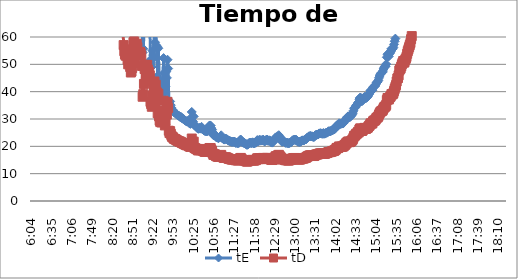
| Category | tE | tD |
|---|---|---|
| 0.25277777777777777 | 17882.69 | 12549.256 |
| 0.2534722222222222 | 17882.69 | 12549.256 |
| 0.25416666666666665 | 17882.69 | 12549.256 |
| 0.2548611111111111 | 17882.69 | 12549.256 |
| 0.2555555555555556 | 17882.69 | 12549.256 |
| 0.25625000000000003 | 17882.69 | 12549.256 |
| 0.2569444444444445 | 17882.69 | 12549.256 |
| 0.2576388888888889 | 17882.69 | 12549.256 |
| 0.25833333333333336 | 17882.69 | 12549.256 |
| 0.2590277777777778 | 17882.69 | 12549.256 |
| 0.25972222222222224 | 17882.69 | 12549.256 |
| 0.2604166666666667 | 17882.69 | 12549.256 |
| 0.2611111111111111 | 8941.345 | 6274.628 |
| 0.26180555555555557 | 8941.345 | 6274.628 |
| 0.2625 | 8941.345 | 6274.628 |
| 0.26319444444444445 | 8941.345 | 6274.628 |
| 0.2638888888888889 | 8941.345 | 6274.628 |
| 0.26458333333333334 | 8941.345 | 6274.628 |
| 0.2652777777777778 | 8941.345 | 6274.628 |
| 0.2659722222222222 | 8941.345 | 6274.628 |
| 0.26666666666666666 | 5960.897 | 4183.085 |
| 0.2673611111111111 | 5960.897 | 4183.085 |
| 0.26805555555555555 | 5960.897 | 4183.085 |
| 0.26875 | 5960.897 | 4183.085 |
| 0.26944444444444443 | 5960.897 | 4183.085 |
| 0.2701388888888889 | 4470.672 | 3137.314 |
| 0.2708333333333333 | 4470.672 | 3137.314 |
| 0.27152777777777776 | 4470.672 | 3137.314 |
| 0.2722222222222222 | 4470.672 | 3137.314 |
| 0.27291666666666664 | 3576.538 | 2509.851 |
| 0.2736111111111111 | 3576.538 | 2509.851 |
| 0.2743055555555555 | 3576.538 | 2509.851 |
| 0.27499999999999997 | 2980.448 | 2091.543 |
| 0.27569444444444446 | 2980.448 | 2091.543 |
| 0.27638888888888885 | 2980.448 | 2091.543 |
| 0.27708333333333335 | 2980.448 | 2091.543 |
| 0.2777777777777778 | 2554.67 | 1792.751 |
| 0.27847222222222223 | 2554.67 | 1792.751 |
| 0.2791666666666667 | 2235.336 | 1568.657 |
| 0.2798611111111111 | 2235.336 | 1568.657 |
| 0.28055555555555556 | 2235.336 | 1568.657 |
| 0.28125 | 1986.966 | 1394.362 |
| 0.28194444444444444 | 1986.966 | 1394.362 |
| 0.2826388888888889 | 1788.269 | 1254.926 |
| 0.2833333333333333 | 1788.269 | 1254.926 |
| 0.28402777777777777 | 1625.699 | 1140.841 |
| 0.2847222222222222 | 1625.699 | 1140.841 |
| 0.28541666666666665 | 1490.224 | 1045.771 |
| 0.28611111111111115 | 1490.224 | 1045.771 |
| 0.28680555555555554 | 1375.592 | 965.327 |
| 0.28750000000000003 | 1375.592 | 965.327 |
| 0.2881944444444445 | 1277.335 | 896.375 |
| 0.2888888888888889 | 1192.179 | 836.617 |
| 0.28958333333333336 | 1117.668 | 784.328 |
| 0.2902777777777778 | 1117.668 | 784.328 |
| 0.29097222222222224 | 1051.923 | 738.192 |
| 0.2916666666666667 | 993.483 | 697.181 |
| 0.2923611111111111 | 941.194 | 660.487 |
| 0.29305555555555557 | 941.194 | 660.487 |
| 0.29375 | 894.134 | 627.463 |
| 0.29444444444444445 | 851.557 | 597.584 |
| 0.2951388888888889 | 812.85 | 570.421 |
| 0.29583333333333334 | 777.508 | 545.62 |
| 0.2965277777777778 | 745.112 | 522.886 |
| 0.2972222222222222 | 715.308 | 501.97 |
| 0.29791666666666666 | 687.796 | 482.664 |
| 0.2986111111111111 | 662.322 | 464.787 |
| 0.29930555555555555 | 638.667 | 448.188 |
| 0.3 | 616.644 | 432.733 |
| 0.30277777777777776 | 541.9 | 380.28 |
| 0.3055555555555555 | 458.531 | 321.776 |
| 0.30833333333333335 | 397.393 | 278.872 |
| 0.30972222222222223 | 372.556 | 261.443 |
| 0.3111111111111111 | 343.898 | 241.332 |
| 0.3125 | 319.334 | 224.094 |
| 0.31319444444444444 | 308.322 | 216.366 |
| 0.3138888888888889 | 298.045 | 209.154 |
| 0.3145833333333333 | 293.159 | 205.726 |
| 0.31527777777777777 | 283.852 | 199.195 |
| 0.3159722222222222 | 275.118 | 193.065 |
| 0.31666666666666665 | 266.906 | 187.302 |
| 0.31736111111111115 | 262.981 | 184.548 |
| 0.31805555555555554 | 255.467 | 179.275 |
| 0.31875000000000003 | 244.968 | 171.908 |
| 0.3194444444444445 | 241.658 | 169.585 |
| 0.3201388888888889 | 238.436 | 167.323 |
| 0.32083333333333336 | 235.299 | 165.122 |
| 0.3215277777777778 | 229.265 | 160.888 |
| 0.32222222222222224 | 223.534 | 156.866 |
| 0.3229166666666667 | 215.454 | 151.196 |
| 0.3236111111111111 | 207.938 | 145.922 |
| 0.32430555555555557 | 198.697 | 139.436 |
| 0.325 | 192.287 | 134.938 |
| 0.32569444444444445 | 184.358 | 129.374 |
| 0.3263888888888889 | 178.827 | 125.493 |
| 0.32708333333333334 | 173.618 | 121.837 |
| 0.3277777777777778 | 170.311 | 119.517 |
| 0.3284722222222222 | 167.128 | 117.283 |
| 0.32916666666666666 | 164.061 | 115.131 |
| 0.3298611111111111 | 159.667 | 112.047 |
| 0.33055555555555555 | 158.254 | 111.055 |
| 0.33125 | 155.502 | 109.124 |
| 0.33194444444444443 | 150.275 | 105.456 |
| 0.3326388888888889 | 144.215 | 101.204 |
| 0.3333333333333333 | 138.626 | 97.281 |
| 0.3340277777777778 | 134.456 | 94.355 |
| 0.3347222222222222 | 131.49 | 92.274 |
| 0.3354166666666667 | 127.733 | 89.638 |
| 0.3361111111111111 | 124.185 | 87.148 |
| 0.3368055555555556 | 120.829 | 84.792 |
| 0.33749999999999997 | 118.428 | 83.108 |
| 0.33819444444444446 | 116.121 | 81.489 |
| 0.33888888888888885 | 113.182 | 79.426 |
| 0.33958333333333335 | 110.387 | 77.465 |
| 0.34027777777777773 | 107.727 | 75.598 |
| 0.34097222222222223 | 105.192 | 73.819 |
| 0.3416666666666666 | 102.187 | 71.71 |
| 0.3423611111111111 | 101.606 | 71.303 |
| 0.3430555555555555 | 100.465 | 70.501 |
| 0.34375 | 98.799 | 69.333 |
| 0.3444444444444445 | 100.465 | 70.501 |
| 0.3451388888888889 | 99.348 | 69.718 |
| 0.3458333333333334 | 97.72 | 68.575 |
| 0.34652777777777777 | 97.189 | 68.202 |
| 0.34722222222222227 | 97.189 | 68.202 |
| 0.34791666666666665 | 96.663 | 67.834 |
| 0.34861111111111115 | 97.72 | 68.575 |
| 0.34930555555555554 | 98.799 | 69.333 |
| 0.35000000000000003 | 99.903 | 70.108 |
| 0.3506944444444444 | 100.465 | 70.501 |
| 0.3513888888888889 | 100.465 | 70.501 |
| 0.3520833333333333 | 99.903 | 70.108 |
| 0.3527777777777778 | 98.799 | 69.333 |
| 0.3534722222222222 | 98.257 | 68.952 |
| 0.3541666666666667 | 96.143 | 67.469 |
| 0.3548611111111111 | 95.629 | 67.108 |
| 0.35555555555555557 | 95.121 | 66.751 |
| 0.35625 | 93.627 | 65.703 |
| 0.35694444444444445 | 94.617 | 66.398 |
| 0.3576388888888889 | 93.139 | 65.361 |
| 0.35833333333333334 | 89.413 | 62.746 |
| 0.3590277777777778 | 81.285 | 57.042 |
| 0.3597222222222222 | 78.09 | 54.8 |
| 0.36041666666666666 | 76.422 | 53.629 |
| 0.3611111111111111 | 75.774 | 53.175 |
| 0.36180555555555555 | 78.778 | 55.283 |
| 0.3625 | 75.774 | 53.175 |
| 0.36319444444444443 | 73.591 | 51.643 |
| 0.3638888888888889 | 71.246 | 49.997 |
| 0.3645833333333333 | 72.991 | 51.221 |
| 0.3652777777777778 | 75.454 | 52.95 |
| 0.3659722222222222 | 69.854 | 49.021 |
| 0.3666666666666667 | 66.976 | 47.001 |
| 0.3673611111111111 | 67.482 | 47.356 |
| 0.3680555555555556 | 69.313 | 48.641 |
| 0.36874999999999997 | 79.127 | 55.528 |
| 0.36944444444444446 | 82.79 | 58.098 |
| 0.37013888888888885 | 83.175 | 58.369 |
| 0.37083333333333335 | 71.818 | 50.399 |
| 0.37152777777777773 | 76.097 | 53.401 |
| 0.37222222222222223 | 80.917 | 56.784 |
| 0.3729166666666666 | 82.031 | 57.565 |
| 0.3736111111111111 | 80.191 | 56.275 |
| 0.3743055555555555 | 75.774 | 53.175 |
| 0.375 | 76.75 | 53.859 |
| 0.3756944444444445 | 77.414 | 54.326 |
| 0.3763888888888889 | 77.751 | 54.562 |
| 0.3770833333333334 | 77.081 | 54.092 |
| 0.37777777777777777 | 75.774 | 53.175 |
| 0.37847222222222227 | 70.404 | 49.407 |
| 0.37916666666666665 | 54.355 | 38.144 |
| 0.37986111111111115 | 55.709 | 39.094 |
| 0.38055555555555554 | 61.033 | 42.83 |
| 0.38125000000000003 | 68.78 | 48.266 |
| 0.3819444444444444 | 70.963 | 49.799 |
| 0.3826388888888889 | 62.527 | 43.879 |
| 0.3833333333333333 | 64.096 | 44.979 |
| 0.3840277777777778 | 70.963 | 49.799 |
| 0.3847222222222222 | 68.516 | 48.081 |
| 0.3854166666666667 | 64.326 | 45.141 |
| 0.3861111111111111 | 67.228 | 47.178 |
| 0.38680555555555557 | 65.504 | 45.968 |
| 0.3875 | 51.684 | 36.27 |
| 0.38819444444444445 | 50.516 | 35.45 |
| 0.3888888888888889 | 49.128 | 34.476 |
| 0.38958333333333334 | 55.024 | 38.613 |
| 0.3902777777777778 | 53.381 | 37.46 |
| 0.3909722222222222 | 52.289 | 36.694 |
| 0.39166666666666666 | 62.309 | 43.726 |
| 0.3923611111111111 | 58.061 | 40.744 |
| 0.39305555555555555 | 60.619 | 42.54 |
| 0.39375 | 56.951 | 39.966 |
| 0.39444444444444443 | 56.412 | 39.588 |
| 0.3951388888888889 | 45.736 | 32.095 |
| 0.3958333333333333 | 55.883 | 39.216 |
| 0.3965277777777778 | 44.155 | 30.986 |
| 0.3972222222222222 | 41.88 | 29.389 |
| 0.3979166666666667 | 41.11 | 28.849 |
| 0.3986111111111111 | 42.679 | 29.95 |
| 0.3993055555555556 | 40.921 | 28.717 |
| 0.39999999999999997 | 43.938 | 30.834 |
| 0.40069444444444446 | 42.477 | 29.808 |
| 0.40138888888888885 | 52.289 | 36.694 |
| 0.40208333333333335 | 46.936 | 32.938 |
| 0.40277777777777773 | 39.389 | 27.642 |
| 0.40347222222222223 | 41.782 | 29.321 |
| 0.4041666666666666 | 47.309 | 33.199 |
| 0.4048611111111111 | 45.045 | 31.61 |
| 0.4055555555555555 | 51.684 | 36.27 |
| 0.40625 | 48.463 | 34.009 |
| 0.4069444444444445 | 36.645 | 25.716 |
| 0.4076388888888889 | 35.411 | 24.85 |
| 0.4083333333333334 | 36.421 | 25.559 |
| 0.40902777777777777 | 35.064 | 24.606 |
| 0.40972222222222227 | 34.062 | 23.903 |
| 0.41041666666666665 | 33.426 | 23.457 |
| 0.41111111111111115 | 33.301 | 23.369 |
| 0.41180555555555554 | 32.752 | 22.984 |
| 0.41250000000000003 | 32.455 | 22.775 |
| 0.4131944444444444 | 32.279 | 22.652 |
| 0.4138888888888889 | 32.221 | 22.611 |
| 0.4145833333333333 | 31.933 | 22.409 |
| 0.4152777777777778 | 31.651 | 22.211 |
| 0.4159722222222222 | 31.539 | 22.133 |
| 0.4173611111111111 | 31.318 | 21.978 |
| 0.41805555555555557 | 31.209 | 21.901 |
| 0.41875 | 31.046 | 21.787 |
| 0.41944444444444445 | 30.779 | 21.599 |
| 0.4201388888888889 | 30.885 | 21.674 |
| 0.42083333333333334 | 30.569 | 21.452 |
| 0.4215277777777778 | 30.31 | 21.27 |
| 0.4222222222222222 | 30.207 | 21.198 |
| 0.42291666666666666 | 30.005 | 21.056 |
| 0.4236111111111111 | 29.854 | 20.95 |
| 0.42430555555555555 | 29.656 | 20.811 |
| 0.425 | 29.461 | 20.674 |
| 0.42569444444444443 | 29.316 | 20.573 |
| 0.4263888888888889 | 29.125 | 20.439 |
| 0.4270833333333333 | 29.03 | 20.372 |
| 0.4277777777777778 | 29.316 | 20.573 |
| 0.4284722222222222 | 28.89 | 20.273 |
| 0.4291666666666667 | 28.521 | 20.015 |
| 0.4298611111111111 | 28.43 | 19.951 |
| 0.4305555555555556 | 28.206 | 19.794 |
| 0.43124999999999997 | 28.983 | 20.339 |
| 0.43194444444444446 | 32.573 | 22.858 |
| 0.43263888888888885 | 30.939 | 21.712 |
| 0.43333333333333335 | 29.078 | 20.405 |
| 0.43402777777777773 | 30.939 | 21.712 |
| 0.43472222222222223 | 27.725 | 19.456 |
| 0.4354166666666666 | 27.554 | 19.336 |
| 0.4361111111111111 | 27.344 | 19.188 |
| 0.4368055555555555 | 27.177 | 19.072 |
| 0.4375 | 27.136 | 19.043 |
| 0.4381944444444445 | 26.532 | 18.619 |
| 0.4388888888888889 | 26.415 | 18.537 |
| 0.4395833333333334 | 26.493 | 18.591 |
| 0.44027777777777777 | 26.811 | 18.814 |
| 0.44097222222222227 | 26.493 | 18.591 |
| 0.44166666666666665 | 26.493 | 18.591 |
| 0.44236111111111115 | 27.136 | 19.043 |
| 0.44305555555555554 | 26.337 | 18.482 |
| 0.44375000000000003 | 26.376 | 18.509 |
| 0.4444444444444444 | 25.992 | 18.24 |
| 0.4451388888888889 | 25.805 | 18.109 |
| 0.4458333333333333 | 25.62 | 17.979 |
| 0.4465277777777778 | 25.62 | 17.979 |
| 0.4472222222222222 | 25.547 | 17.928 |
| 0.4479166666666667 | 25.547 | 17.928 |
| 0.4486111111111111 | 25.547 | 17.928 |
| 0.44930555555555557 | 26.183 | 18.374 |
| 0.45 | 26.972 | 18.928 |
| 0.45069444444444445 | 27.597 | 19.366 |
| 0.4513888888888889 | 27.639 | 19.396 |
| 0.45208333333333334 | 27.554 | 19.336 |
| 0.4527777777777778 | 26.651 | 18.702 |
| 0.4534722222222222 | 26.068 | 18.293 |
| 0.45416666666666666 | 24.872 | 17.454 |
| 0.4548611111111111 | 24.101 | 16.913 |
| 0.45555555555555555 | 24.068 | 16.89 |
| 0.45625 | 24.363 | 17.097 |
| 0.45694444444444443 | 24.133 | 16.936 |
| 0.4576388888888889 | 23.437 | 16.447 |
| 0.4583333333333333 | 23.315 | 16.361 |
| 0.4590277777777778 | 23.254 | 16.319 |
| 0.4597222222222222 | 23.074 | 16.193 |
| 0.4604166666666667 | 23.015 | 16.151 |
| 0.4611111111111111 | 23.194 | 16.277 |
| 0.4618055555555556 | 23.407 | 16.426 |
| 0.46249999999999997 | 23.686 | 16.622 |
| 0.46319444444444446 | 24.036 | 16.867 |
| 0.46388888888888885 | 23.194 | 16.277 |
| 0.46458333333333335 | 22.897 | 16.068 |
| 0.46527777777777773 | 22.868 | 16.048 |
| 0.46597222222222223 | 22.494 | 15.785 |
| 0.4666666666666666 | 22.466 | 15.765 |
| 0.4673611111111111 | 22.752 | 15.966 |
| 0.4680555555555555 | 22.752 | 15.966 |
| 0.46875 | 22.665 | 15.905 |
| 0.4694444444444445 | 22.551 | 15.825 |
| 0.4701388888888889 | 22.325 | 15.667 |
| 0.4708333333333334 | 22.132 | 15.531 |
| 0.47152777777777777 | 21.996 | 15.436 |
| 0.47222222222222227 | 21.942 | 15.398 |
| 0.47291666666666665 | 21.861 | 15.341 |
| 0.47361111111111115 | 21.702 | 15.23 |
| 0.47430555555555554 | 21.65 | 15.193 |
| 0.47500000000000003 | 21.65 | 15.193 |
| 0.4756944444444444 | 21.65 | 15.193 |
| 0.4763888888888889 | 21.676 | 15.211 |
| 0.4770833333333333 | 21.755 | 15.267 |
| 0.4777777777777778 | 21.571 | 15.138 |
| 0.4784722222222222 | 21.264 | 14.922 |
| 0.4791666666666667 | 21.34 | 14.975 |
| 0.4798611111111111 | 21.264 | 14.922 |
| 0.48055555555555557 | 21.213 | 14.886 |
| 0.48125 | 21.188 | 14.869 |
| 0.48194444444444445 | 21.264 | 14.922 |
| 0.4826388888888889 | 21.729 | 15.248 |
| 0.48333333333333334 | 22.381 | 15.706 |
| 0.4840277777777778 | 22.466 | 15.765 |
| 0.4847222222222222 | 21.861 | 15.341 |
| 0.48541666666666666 | 21.519 | 15.101 |
| 0.4861111111111111 | 21.519 | 15.101 |
| 0.48680555555555555 | 21.264 | 14.922 |
| 0.4875 | 21.365 | 14.993 |
| 0.48819444444444443 | 21.063 | 14.781 |
| 0.4888888888888889 | 21.038 | 14.764 |
| 0.4895833333333333 | 20.746 | 14.558 |
| 0.4902777777777778 | 20.578 | 14.441 |
| 0.4909722222222222 | 20.578 | 14.441 |
| 0.4916666666666667 | 20.722 | 14.541 |
| 0.4923611111111111 | 21.014 | 14.746 |
| 0.4930555555555556 | 21.34 | 14.975 |
| 0.49374999999999997 | 21.314 | 14.957 |
| 0.49444444444444446 | 21.289 | 14.94 |
| 0.49513888888888885 | 21.188 | 14.869 |
| 0.49583333333333335 | 21.238 | 14.904 |
| 0.49652777777777773 | 21.468 | 15.065 |
| 0.49722222222222223 | 21.163 | 14.851 |
| 0.4979166666666666 | 21.063 | 14.781 |
| 0.4986111111111111 | 21.188 | 14.869 |
| 0.4993055555555555 | 21.314 | 14.957 |
| 0.5 | 21.34 | 14.975 |
| 0.5006944444444444 | 21.755 | 15.267 |
| 0.5013888888888889 | 22.27 | 15.628 |
| 0.5020833333333333 | 22.187 | 15.57 |
| 0.5027777777777778 | 21.835 | 15.323 |
| 0.5034722222222222 | 22.27 | 15.628 |
| 0.5041666666666667 | 22.381 | 15.706 |
| 0.5048611111111111 | 22.077 | 15.493 |
| 0.5055555555555555 | 22.242 | 15.609 |
| 0.50625 | 22.132 | 15.531 |
| 0.5069444444444444 | 22.215 | 15.589 |
| 0.5076388888888889 | 22.466 | 15.765 |
| 0.5083333333333333 | 22.215 | 15.589 |
| 0.5090277777777777 | 21.808 | 15.304 |
| 0.5097222222222222 | 21.888 | 15.36 |
| 0.5104166666666666 | 22.242 | 15.609 |
| 0.5111111111111112 | 22.215 | 15.589 |
| 0.5118055555555555 | 22.494 | 15.785 |
| 0.5125000000000001 | 22.077 | 15.493 |
| 0.5131944444444444 | 22.023 | 15.455 |
| 0.513888888888889 | 22.215 | 15.589 |
| 0.5145833333333333 | 22.159 | 15.551 |
| 0.5152777777777778 | 21.996 | 15.436 |
| 0.5159722222222222 | 21.545 | 15.12 |
| 0.5166666666666667 | 21.442 | 15.047 |
| 0.517361111111111 | 21.365 | 14.993 |
| 0.5180555555555556 | 21.519 | 15.101 |
| 0.5187499999999999 | 21.915 | 15.379 |
| 0.5194444444444445 | 22.27 | 15.628 |
| 0.5201388888888888 | 22.608 | 15.865 |
| 0.5208333333333334 | 23.285 | 16.34 |
| 0.5215277777777778 | 23.224 | 16.298 |
| 0.5222222222222223 | 23.254 | 16.319 |
| 0.5229166666666667 | 23.686 | 16.622 |
| 0.5236111111111111 | 23.686 | 16.622 |
| 0.5243055555555556 | 24.068 | 16.89 |
| 0.525 | 23.623 | 16.578 |
| 0.5256944444444445 | 23.104 | 16.214 |
| 0.5263888888888889 | 22.723 | 15.946 |
| 0.5270833333333333 | 22.132 | 15.531 |
| 0.5277777777777778 | 21.624 | 15.174 |
| 0.5284722222222222 | 21.755 | 15.267 |
| 0.5291666666666667 | 22.023 | 15.455 |
| 0.5298611111111111 | 21.915 | 15.379 |
| 0.5305555555555556 | 21.494 | 15.083 |
| 0.53125 | 21.314 | 14.957 |
| 0.5319444444444444 | 21.264 | 14.922 |
| 0.5326388888888889 | 21.365 | 14.993 |
| 0.5333333333333333 | 21.213 | 14.886 |
| 0.5340277777777778 | 21.238 | 14.904 |
| 0.5347222222222222 | 21.088 | 14.799 |
| 0.5354166666666667 | 21.213 | 14.886 |
| 0.5361111111111111 | 21.365 | 14.993 |
| 0.5368055555555555 | 21.365 | 14.993 |
| 0.5375 | 21.597 | 15.156 |
| 0.5381944444444444 | 21.729 | 15.248 |
| 0.5388888888888889 | 22.187 | 15.57 |
| 0.5395833333333333 | 22.298 | 15.647 |
| 0.5402777777777777 | 22.353 | 15.687 |
| 0.5409722222222222 | 22.409 | 15.726 |
| 0.5416666666666666 | 22.438 | 15.746 |
| 0.5423611111111112 | 22.27 | 15.628 |
| 0.5430555555555555 | 22.325 | 15.667 |
| 0.5437500000000001 | 22.023 | 15.455 |
| 0.5444444444444444 | 21.729 | 15.248 |
| 0.545138888888889 | 21.702 | 15.23 |
| 0.5458333333333333 | 21.624 | 15.174 |
| 0.5465277777777778 | 21.65 | 15.193 |
| 0.5472222222222222 | 21.676 | 15.211 |
| 0.5479166666666667 | 21.861 | 15.341 |
| 0.548611111111111 | 22.105 | 15.512 |
| 0.5493055555555556 | 22.187 | 15.57 |
| 0.5499999999999999 | 22.132 | 15.531 |
| 0.5506944444444445 | 22.159 | 15.551 |
| 0.5513888888888888 | 22.298 | 15.647 |
| 0.5520833333333334 | 22.494 | 15.785 |
| 0.5527777777777778 | 22.551 | 15.825 |
| 0.5534722222222223 | 22.636 | 15.885 |
| 0.5541666666666667 | 23.074 | 16.193 |
| 0.5548611111111111 | 23.254 | 16.319 |
| 0.5555555555555556 | 23.376 | 16.404 |
| 0.55625 | 23.654 | 16.6 |
| 0.5569444444444445 | 23.654 | 16.6 |
| 0.5576388888888889 | 23.812 | 16.71 |
| 0.5583333333333333 | 23.654 | 16.6 |
| 0.5590277777777778 | 23.654 | 16.6 |
| 0.5597222222222222 | 23.654 | 16.6 |
| 0.5604166666666667 | 23.499 | 16.49 |
| 0.5611111111111111 | 23.437 | 16.447 |
| 0.5618055555555556 | 23.468 | 16.469 |
| 0.5625 | 23.749 | 16.666 |
| 0.5631944444444444 | 24.068 | 16.89 |
| 0.5638888888888889 | 24.231 | 17.004 |
| 0.5645833333333333 | 24.231 | 17.004 |
| 0.5652777777777778 | 24.33 | 17.074 |
| 0.5659722222222222 | 24.363 | 17.097 |
| 0.5666666666666667 | 24.564 | 17.238 |
| 0.5673611111111111 | 24.734 | 17.357 |
| 0.5680555555555555 | 24.734 | 17.357 |
| 0.56875 | 24.803 | 17.405 |
| 0.5694444444444444 | 24.7 | 17.333 |
| 0.5701388888888889 | 24.598 | 17.262 |
| 0.5708333333333333 | 24.632 | 17.285 |
| 0.5715277777777777 | 24.872 | 17.454 |
| 0.5722222222222222 | 24.598 | 17.262 |
| 0.5729166666666666 | 24.734 | 17.357 |
| 0.5736111111111112 | 24.666 | 17.309 |
| 0.5743055555555555 | 24.941 | 17.502 |
| 0.5750000000000001 | 25.046 | 17.576 |
| 0.5756944444444444 | 25.011 | 17.551 |
| 0.576388888888889 | 25.294 | 17.75 |
| 0.5770833333333333 | 25.51 | 17.902 |
| 0.5777777777777778 | 25.51 | 17.902 |
| 0.5784722222222222 | 25.474 | 17.876 |
| 0.5791666666666667 | 25.547 | 17.928 |
| 0.579861111111111 | 25.694 | 18.031 |
| 0.5805555555555556 | 25.842 | 18.135 |
| 0.5812499999999999 | 25.955 | 18.214 |
| 0.5819444444444445 | 26.03 | 18.267 |
| 0.5826388888888888 | 26.259 | 18.428 |
| 0.5833333333333334 | 26.221 | 18.401 |
| 0.5840277777777778 | 26.651 | 18.702 |
| 0.5847222222222223 | 26.811 | 18.814 |
| 0.5854166666666667 | 27.512 | 19.307 |
| 0.5861111111111111 | 27.725 | 19.456 |
| 0.5868055555555556 | 27.554 | 19.336 |
| 0.5875 | 27.725 | 19.456 |
| 0.5881944444444445 | 28.43 | 19.951 |
| 0.5888888888888889 | 28.206 | 19.794 |
| 0.5895833333333333 | 28.206 | 19.794 |
| 0.5902777777777778 | 28.251 | 19.825 |
| 0.5909722222222222 | 28.34 | 19.888 |
| 0.5916666666666667 | 28.34 | 19.888 |
| 0.5923611111111111 | 28.43 | 19.951 |
| 0.5930555555555556 | 28.567 | 20.047 |
| 0.59375 | 29.03 | 20.372 |
| 0.5944444444444444 | 29.268 | 20.539 |
| 0.5951388888888889 | 29.607 | 20.777 |
| 0.5958333333333333 | 30.156 | 21.162 |
| 0.5965277777777778 | 30.413 | 21.342 |
| 0.5972222222222222 | 30.832 | 21.637 |
| 0.5979166666666667 | 30.993 | 21.749 |
| 0.5986111111111111 | 30.939 | 21.712 |
| 0.5993055555555555 | 30.674 | 21.525 |
| 0.6 | 30.779 | 21.599 |
| 0.6006944444444444 | 31.1 | 21.825 |
| 0.6013888888888889 | 31.263 | 21.939 |
| 0.6020833333333333 | 31.707 | 22.25 |
| 0.6027777777777777 | 32.163 | 22.571 |
| 0.6034722222222222 | 32.994 | 23.154 |
| 0.6041666666666666 | 33.933 | 23.813 |
| 0.6048611111111112 | 34.062 | 23.903 |
| 0.6055555555555555 | 34.324 | 24.087 |
| 0.6062500000000001 | 34.995 | 24.558 |
| 0.6069444444444444 | 35.064 | 24.606 |
| 0.607638888888889 | 35.411 | 24.85 |
| 0.6083333333333333 | 36.054 | 25.301 |
| 0.6090277777777778 | 35.765 | 25.099 |
| 0.6097222222222222 | 37.256 | 26.144 |
| 0.6104166666666667 | 37.807 | 26.531 |
| 0.611111111111111 | 37.807 | 26.531 |
| 0.6118055555555556 | 37.333 | 26.199 |
| 0.6124999999999999 | 36.495 | 25.611 |
| 0.6131944444444445 | 36.796 | 25.822 |
| 0.6138888888888888 | 37.333 | 26.199 |
| 0.6145833333333334 | 37.727 | 26.475 |
| 0.6152777777777778 | 38.129 | 26.757 |
| 0.6159722222222223 | 37.807 | 26.531 |
| 0.6166666666666667 | 37.569 | 26.364 |
| 0.6173611111111111 | 37.887 | 26.587 |
| 0.6180555555555556 | 38.048 | 26.701 |
| 0.61875 | 38.293 | 26.872 |
| 0.6194444444444445 | 38.875 | 27.281 |
| 0.6201388888888889 | 39.131 | 27.46 |
| 0.6208333333333333 | 39.651 | 27.825 |
| 0.6215277777777778 | 40.459 | 28.392 |
| 0.6222222222222222 | 40.367 | 28.328 |
| 0.6229166666666667 | 40.367 | 28.328 |
| 0.6236111111111111 | 40.55 | 28.456 |
| 0.6243055555555556 | 41.491 | 29.117 |
| 0.625 | 41.88 | 29.389 |
| 0.6256944444444444 | 41.88 | 29.389 |
| 0.6263888888888889 | 42.077 | 29.528 |
| 0.6270833333333333 | 42.578 | 29.879 |
| 0.6277777777777778 | 43.195 | 30.312 |
| 0.6284722222222222 | 43.51 | 30.533 |
| 0.6291666666666667 | 43.616 | 30.608 |
| 0.6298611111111111 | 44.155 | 30.986 |
| 0.6305555555555555 | 45.045 | 31.61 |
| 0.63125 | 45.736 | 32.095 |
| 0.6319444444444444 | 46.328 | 32.511 |
| 0.6326388888888889 | 46.691 | 32.766 |
| 0.6333333333333333 | 46.936 | 32.938 |
| 0.6340277777777777 | 47.06 | 33.024 |
| 0.6347222222222222 | 47.56 | 33.376 |
| 0.6354166666666666 | 48.332 | 33.917 |
| 0.6361111111111112 | 48.86 | 34.288 |
| 0.6368055555555555 | 49.264 | 34.571 |
| 0.6375000000000001 | 49.264 | 34.571 |
| 0.6381944444444444 | 50.092 | 35.152 |
| 0.638888888888889 | 52.596 | 36.91 |
| 0.6395833333333333 | 53.702 | 37.685 |
| 0.6402777777777778 | 53.381 | 37.46 |
| 0.6409722222222222 | 52.907 | 37.128 |
| 0.6416666666666667 | 53.864 | 37.799 |
| 0.642361111111111 | 54.19 | 38.028 |
| 0.6430555555555556 | 54.687 | 38.377 |
| 0.6437499999999999 | 55.709 | 39.094 |
| 0.6444444444444445 | 55.536 | 38.973 |
| 0.6451388888888888 | 55.709 | 39.094 |
| 0.6458333333333334 | 56.235 | 39.463 |
| 0.6465277777777778 | 57.316 | 40.222 |
| 0.6472222222222223 | 58.44 | 41.011 |
| 0.6479166666666667 | 59.411 | 41.692 |
| 0.6486111111111111 | 60.414 | 42.396 |
| 0.6493055555555556 | 62.309 | 43.726 |
| 0.65 | 63.867 | 44.819 |
| 0.6506944444444445 | 64.096 | 44.979 |
| 0.6513888888888889 | 65.504 | 45.968 |
| 0.6520833333333333 | 67.995 | 47.716 |
| 0.6527777777777778 | 68.78 | 48.266 |
| 0.6534722222222222 | 69.045 | 48.453 |
| 0.6541666666666667 | 70.128 | 49.213 |
| 0.6548611111111111 | 71.246 | 49.997 |
| 0.6555555555555556 | 72.108 | 50.602 |
| 0.65625 | 72.991 | 51.221 |
| 0.6569444444444444 | 72.108 | 50.602 |
| 0.6576388888888889 | 72.4 | 50.807 |
| 0.6583333333333333 | 73.591 | 51.643 |
| 0.6590277777777778 | 74.202 | 52.072 |
| 0.6597222222222222 | 75.137 | 52.728 |
| 0.6604166666666667 | 76.75 | 53.859 |
| 0.6611111111111111 | 78.09 | 54.8 |
| 0.6618055555555555 | 79.127 | 55.528 |
| 0.6625 | 80.191 | 56.275 |
| 0.6631944444444444 | 81.285 | 57.042 |
| 0.6638888888888889 | 82.409 | 57.831 |
| 0.6645833333333333 | 84.352 | 59.195 |
| 0.6652777777777777 | 85.974 | 60.333 |
| 0.6659722222222222 | 87.233 | 61.216 |
| 0.6666666666666666 | 88.092 | 61.819 |
| 0.6673611111111111 | 89.863 | 63.062 |
| 0.6680555555555556 | 92.656 | 65.022 |
| 0.6687500000000001 | 95.121 | 66.751 |
| 0.6694444444444444 | 96.663 | 67.834 |
| 0.6701388888888888 | 98.257 | 68.952 |
| 0.6708333333333334 | 99.903 | 70.108 |
| 0.6715277777777778 | 102.774 | 72.122 |
| 0.6722222222222222 | 103.969 | 72.961 |
| 0.6729166666666666 | 106.445 | 74.698 |
| 0.6736111111111112 | 109.71 | 76.989 |
| 0.6743055555555556 | 112.47 | 78.926 |
| 0.6749999999999999 | 115.372 | 80.963 |
| 0.6756944444444444 | 118.428 | 83.108 |
| 0.6763888888888889 | 123.329 | 86.547 |
| 0.6770833333333334 | 127.733 | 89.638 |
| 0.6777777777777777 | 129.585 | 90.937 |
| 0.6784722222222223 | 132.464 | 92.957 |
| 0.6791666666666667 | 134.456 | 94.355 |
| 0.6798611111111111 | 138.626 | 97.281 |
| 0.6805555555555555 | 141.926 | 99.597 |
| 0.68125 | 145.388 | 102.026 |
| 0.6819444444444445 | 151.548 | 106.35 |
| 0.6826388888888889 | 154.161 | 108.183 |
| 0.6833333333333332 | 155.502 | 109.124 |
| 0.6840277777777778 | 158.254 | 111.055 |
| 0.6847222222222222 | 162.57 | 114.084 |
| 0.6854166666666667 | 168.705 | 118.389 |
| 0.686111111111111 | 171.949 | 120.666 |
| 0.6868055555555556 | 175.32 | 123.032 |
| 0.6875 | 178.827 | 125.493 |
| 0.6881944444444444 | 182.476 | 128.054 |
| 0.688888888888889 | 188.239 | 132.097 |
| 0.6895833333333333 | 192.287 | 134.938 |
| 0.6902777777777778 | 196.513 | 137.904 |
| 0.6909722222222222 | 200.929 | 141.003 |
| 0.6916666666666668 | 205.548 | 144.244 |
| 0.6923611111111111 | 210.385 | 147.638 |
| 0.6930555555555555 | 215.454 | 151.196 |
| 0.69375 | 220.774 | 154.929 |
| 0.6944444444444445 | 226.363 | 158.851 |
| 0.6951388888888889 | 232.243 | 162.977 |
| 0.6958333333333333 | 238.436 | 167.323 |
| 0.6965277777777777 | 244.968 | 171.908 |
| 0.6972222222222223 | 248.371 | 174.295 |
| 0.6979166666666666 | 255.467 | 179.275 |
| 0.6986111111111111 | 262.981 | 184.548 |
| 0.6993055555555556 | 266.906 | 187.302 |
| 0.7000000000000001 | 270.95 | 190.14 |
| 0.7006944444444444 | 279.417 | 196.082 |
| 0.7013888888888888 | 283.852 | 199.195 |
| 0.7020833333333334 | 288.43 | 202.407 |
| 0.7027777777777778 | 293.159 | 205.726 |
| 0.7034722222222222 | 303.096 | 212.699 |
| 0.7041666666666666 | 308.322 | 216.366 |
| 0.7048611111111112 | 313.731 | 220.162 |
| 0.7055555555555556 | 325.14 | 228.168 |
| 0.7062499999999999 | 331.161 | 232.394 |
| 0.7069444444444444 | 337.409 | 236.778 |
| 0.7076388888888889 | 350.641 | 246.064 |
| 0.7083333333333334 | 357.654 | 250.985 |
| 0.7090277777777777 | 364.953 | 256.107 |
| 0.7097222222222223 | 380.483 | 267.005 |
| 0.7104166666666667 | 388.754 | 272.81 |
| 0.7111111111111111 | 397.393 | 278.872 |
| 0.7118055555555555 | 406.425 | 285.21 |
| 0.7125 | 415.877 | 291.843 |
| 0.7131944444444445 | 425.778 | 298.792 |
| 0.7138888888888889 | 436.163 | 306.079 |
| 0.7145833333333332 | 447.067 | 313.731 |
| 0.7152777777777778 | 470.597 | 330.244 |
| 0.7159722222222222 | 483.316 | 339.169 |
| 0.7166666666666667 | 496.741 | 348.59 |
| 0.717361111111111 | 510.934 | 358.55 |
| 0.7180555555555556 | 525.961 | 369.096 |
| 0.71875 | 541.9 | 380.28 |
| 0.7194444444444444 | 558.834 | 392.164 |
| 0.720138888888889 | 596.09 | 418.309 |
| 0.7208333333333333 | 616.644 | 432.733 |
| 0.7215277777777778 | 638.667 | 448.188 |
| 0.7222222222222222 | 662.322 | 464.787 |
| 0.7229166666666668 | 687.796 | 482.664 |
| 0.7236111111111111 | 715.308 | 501.97 |
| 0.7243055555555555 | 745.112 | 522.886 |
| 0.725 | 777.508 | 545.62 |
| 0.7256944444444445 | 812.85 | 570.421 |
| 0.7263888888888889 | 851.557 | 597.584 |
| 0.7270833333333333 | 851.557 | 597.584 |
| 0.7277777777777777 | 894.134 | 627.463 |
| 0.7284722222222223 | 941.194 | 660.487 |
| 0.7291666666666666 | 993.483 | 697.181 |
| 0.7298611111111111 | 1051.923 | 738.192 |
| 0.7305555555555556 | 1051.923 | 738.192 |
| 0.7312500000000001 | 1117.668 | 784.328 |
| 0.7319444444444444 | 1192.179 | 836.617 |
| 0.7326388888888888 | 1277.335 | 896.375 |
| 0.7333333333333334 | 1277.335 | 896.375 |
| 0.7340277777777778 | 1375.592 | 965.327 |
| 0.7347222222222222 | 1490.224 | 1045.771 |
| 0.7354166666666666 | 1490.224 | 1045.771 |
| 0.7361111111111112 | 1625.699 | 1140.841 |
| 0.7368055555555556 | 1625.699 | 1140.841 |
| 0.7374999999999999 | 1788.269 | 1254.926 |
| 0.7381944444444444 | 1788.269 | 1254.926 |
| 0.7388888888888889 | 1986.966 | 1394.362 |
| 0.7395833333333334 | 1986.966 | 1394.362 |
| 0.7402777777777777 | 2235.336 | 1568.657 |
| 0.7409722222222223 | 2235.336 | 1568.657 |
| 0.7416666666666667 | 2554.67 | 1792.751 |
| 0.7423611111111111 | 2554.67 | 1792.751 |
| 0.7430555555555555 | 2554.67 | 1792.751 |
| 0.74375 | 2980.448 | 2091.543 |
| 0.7444444444444445 | 2980.448 | 2091.543 |
| 0.7451388888888889 | 2980.448 | 2091.543 |
| 0.7458333333333332 | 3576.538 | 2509.851 |
| 0.7465277777777778 | 3576.538 | 2509.851 |
| 0.7472222222222222 | 3576.538 | 2509.851 |
| 0.7479166666666667 | 3576.538 | 2509.851 |
| 0.748611111111111 | 4470.672 | 3137.314 |
| 0.7493055555555556 | 4470.672 | 3137.314 |
| 0.75 | 4470.672 | 3137.314 |
| 0.7506944444444444 | 5960.897 | 4183.085 |
| 0.751388888888889 | 5960.897 | 4183.085 |
| 0.7520833333333333 | 5960.897 | 4183.085 |
| 0.7527777777777778 | 5960.897 | 4183.085 |
| 0.7534722222222222 | 5960.897 | 4183.085 |
| 0.7541666666666668 | 8941.345 | 6274.628 |
| 0.7548611111111111 | 8941.345 | 6274.628 |
| 0.7555555555555555 | 8941.345 | 6274.628 |
| 0.75625 | 8941.345 | 6274.628 |
| 0.7569444444444445 | 8941.345 | 6274.628 |
| 0.7576388888888889 | 8941.345 | 6274.628 |
| 0.7583333333333333 | 8941.345 | 6274.628 |
| 0.7590277777777777 | 17882.69 | 12549.256 |
| 0.7597222222222223 | 17882.69 | 12549.256 |
| 0.7604166666666666 | 17882.69 | 12549.256 |
| 0.7611111111111111 | 17882.69 | 12549.256 |
| 0.7618055555555556 | 17882.69 | 12549.256 |
| 0.7625000000000001 | 17882.69 | 12549.256 |
| 0.7631944444444444 | 17882.69 | 12549.256 |
| 0.7638888888888888 | 17882.69 | 12549.256 |
| 0.7645833333333334 | 17882.69 | 12549.256 |
| 0.7652777777777778 | 17882.69 | 12549.256 |
| 0.7659722222222222 | 17882.69 | 12549.256 |